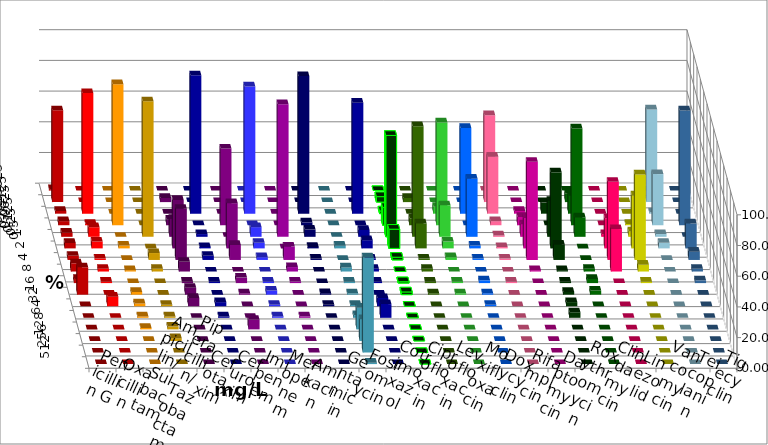
| Category | Penicillin G | Oxacillin | Ampicillin/ Sulbactam | Piperacillin/ Tazobactam | Cefotaxim | Cefuroxim | Imipenem | Meropenem | Amikacin | Gentamicin | Fosfomycin | Cotrimoxazol | Ciprofloxacin | Levofloxacin | Moxifloxacin | Doxycyclin | Rifampicin | Daptomycin | Roxythromycin | Clindamycin | Linezolid | Vancomycin | Teicoplanin | Tigecyclin |
|---|---|---|---|---|---|---|---|---|---|---|---|---|---|---|---|---|---|---|---|---|---|---|---|---|
| 0.015625 | 0.893 | 0 | 0 | 0 | 0 | 0 | 0 | 0 | 0 | 0 | 0 | 0 | 0 | 0 | 0 | 0 | 0 | 0 | 0 | 0 | 0 | 0 | 0 | 0 |
| 0.03125 | 59.821 | 0 | 0 | 0 | 2.703 | 0 | 0 | 0 | 0 | 0 | 0 | 0 | 3.571 | 2.703 | 0 | 0 | 56.637 | 0 | 0 | 5.405 | 0 | 0 | 0 | 60.36 |
| 0.0625 | 1.786 | 78.571 | 0 | 0 | 0 | 0 | 90.179 | 82.883 | 0 | 89.623 | 0 | 72.321 | 1.786 | 0 | 4.464 | 55.856 | 37.168 | 1.802 | 7.207 | 11.712 | 0 | 0 | 0 | 0.901 |
| 0.125 | 2.679 | 0.893 | 91.892 | 0 | 3.604 | 50 | 0 | 0 | 0 | 1.887 | 0 | 0 | 11.607 | 4.505 | 66.964 | 0 | 2.655 | 5.405 | 0 | 63.063 | 0 | 0.885 | 74.775 | 33.333 |
| 0.25 | 2.679 | 6.25 | 0 | 88.288 | 11.712 | 0 | 1.786 | 6.306 | 86.408 | 4.717 | 0 | 4.464 | 66.071 | 72.072 | 20.536 | 37.838 | 0.885 | 8.108 | 23.423 | 12.613 | 1.786 | 3.54 | 0 | 1.802 |
| 0.5 | 3.571 | 4.464 | 1.802 | 0 | 31.532 | 29.464 | 0.893 | 3.604 | 0 | 0.943 | 1.77 | 5.357 | 12.5 | 16.216 | 4.464 | 1.802 | 0.885 | 19.82 | 49.55 | 0 | 19.643 | 34.513 | 16.216 | 3.604 |
| 1.0 | 2.679 | 0.893 | 0 | 4.505 | 33.333 | 9.821 | 2.679 | 1.802 | 8.738 | 0.943 | 0 | 0.893 | 1.786 | 0.901 | 1.786 | 0.901 | 0.885 | 63.964 | 9.91 | 0 | 50.893 | 55.752 | 5.405 | 0 |
| 2.0 | 5.357 | 1.786 | 0.901 | 1.802 | 6.306 | 0 | 0 | 0 | 2.913 | 0 | 2.655 | 1.786 | 0 | 1.802 | 0 | 0 | 0 | 0.901 | 0.901 | 1.802 | 27.679 | 4.425 | 1.802 | 0 |
| 4.0 | 2.679 | 0.893 | 0 | 0 | 0.901 | 3.571 | 0.893 | 0.901 | 0.971 | 0 | 0.885 | 0.893 | 0.893 | 0.901 | 0.893 | 1.802 | 0.885 | 0 | 0.901 | 2.703 | 0 | 0.885 | 1.802 | 0 |
| 8.0 | 17.857 | 0 | 1.802 | 0 | 4.505 | 0.893 | 0 | 2.703 | 0 | 0.943 | 0.885 | 0 | 1.786 | 0.901 | 0.893 | 0.901 | 0 | 0 | 1.802 | 2.703 | 0 | 0 | 0 | 0 |
| 16.0 | 0 | 6.25 | 1.802 | 0.901 | 5.405 | 0 | 2.679 | 0.901 | 0 | 0.943 | 0.885 | 5.357 | 0 | 0 | 0 | 0.901 | 0 | 0 | 2.703 | 0 | 0 | 0 | 0 | 0 |
| 32.0 | 0 | 0 | 0.901 | 0.901 | 0 | 0 | 0.893 | 0.901 | 0.971 | 0 | 1.77 | 8.929 | 0 | 0 | 0 | 0 | 0 | 0 | 3.604 | 0 | 0 | 0 | 0 | 0 |
| 64.0 | 0 | 0 | 0.901 | 1.802 | 0 | 6.25 | 0 | 0 | 0 | 0 | 14.159 | 0 | 0 | 0 | 0 | 0 | 0 | 0 | 0 | 0 | 0 | 0 | 0 | 0 |
| 128.0 | 0 | 0 | 0 | 1.802 | 0 | 0 | 0 | 0 | 0 | 0 | 14.159 | 0 | 0 | 0 | 0 | 0 | 0 | 0 | 0 | 0 | 0 | 0 | 0 | 0 |
| 256.0 | 0 | 0 | 0 | 0 | 0 | 0 | 0 | 0 | 0 | 0 | 61.947 | 0 | 0 | 0 | 0 | 0 | 0 | 0 | 0 | 0 | 0 | 0 | 0 | 0 |
| 512.0 | 0 | 0 | 0 | 0 | 0 | 0 | 0 | 0 | 0 | 0 | 0.885 | 0 | 0 | 0 | 0 | 0 | 0 | 0 | 0 | 0 | 0 | 0 | 0 | 0 |